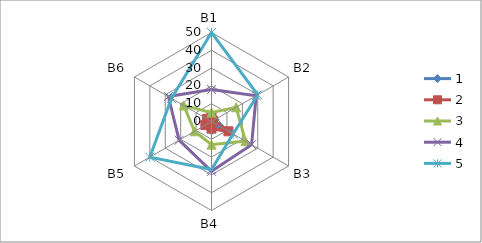
| Category | 1 | 2 | 3 | 4 | 5 |
|---|---|---|---|---|---|
| B1 | 2 | 3 | 5 | 18 | 50 |
| B2 | 2 | 1 | 16 | 29 | 30 |
| B3 | 5 | 11 | 22 | 26 | 14 |
| B4 | 5 | 4 | 13 | 28 | 27 |
| B5 | 2 | 4 | 11 | 21 | 40 |
| B6 | 2 | 3 | 18 | 28 | 26 |